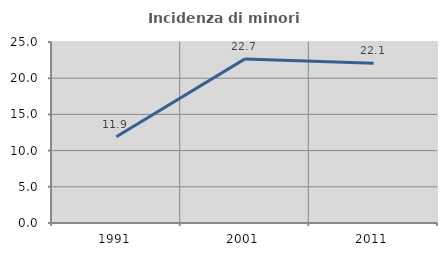
| Category | Incidenza di minori stranieri |
|---|---|
| 1991.0 | 11.905 |
| 2001.0 | 22.667 |
| 2011.0 | 22.078 |